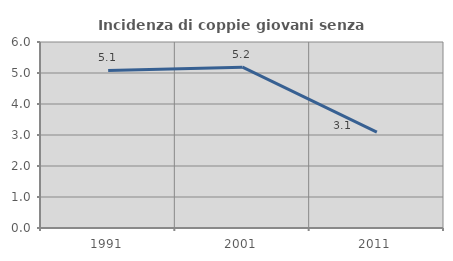
| Category | Incidenza di coppie giovani senza figli |
|---|---|
| 1991.0 | 5.082 |
| 2001.0 | 5.186 |
| 2011.0 | 3.095 |